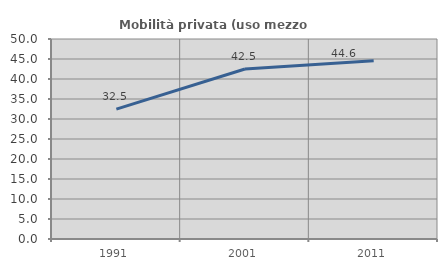
| Category | Mobilità privata (uso mezzo privato) |
|---|---|
| 1991.0 | 32.452 |
| 2001.0 | 42.505 |
| 2011.0 | 44.571 |